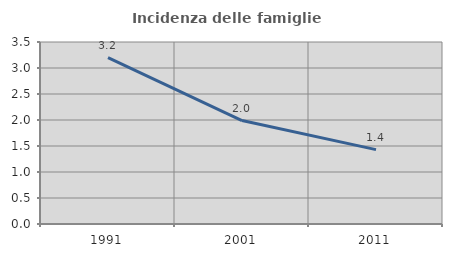
| Category | Incidenza delle famiglie numerose |
|---|---|
| 1991.0 | 3.201 |
| 2001.0 | 1.989 |
| 2011.0 | 1.431 |